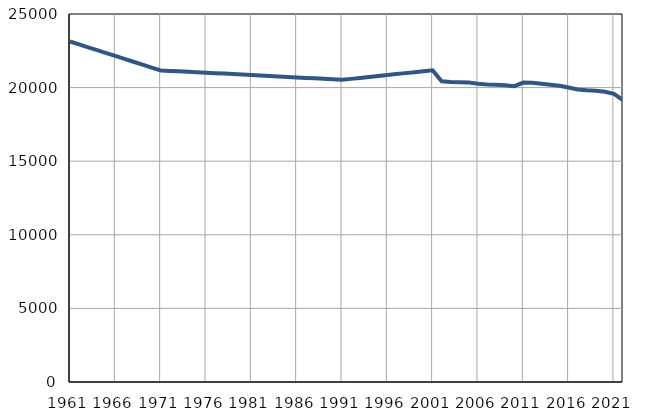
| Category | Број
становника |
|---|---|
| 1961.0 | 23131 |
| 1962.0 | 22934 |
| 1963.0 | 22738 |
| 1964.0 | 22542 |
| 1965.0 | 22345 |
| 1966.0 | 22149 |
| 1967.0 | 21952 |
| 1968.0 | 21756 |
| 1969.0 | 21559 |
| 1970.0 | 21363 |
| 1971.0 | 21166 |
| 1972.0 | 21135 |
| 1973.0 | 21105 |
| 1974.0 | 21074 |
| 1975.0 | 21044 |
| 1976.0 | 21013 |
| 1977.0 | 20982 |
| 1978.0 | 20952 |
| 1979.0 | 20921 |
| 1980.0 | 20891 |
| 1981.0 | 20860 |
| 1982.0 | 20827 |
| 1983.0 | 20793 |
| 1984.0 | 20760 |
| 1985.0 | 20727 |
| 1986.0 | 20694 |
| 1987.0 | 20660 |
| 1988.0 | 20627 |
| 1989.0 | 20594 |
| 1990.0 | 20560 |
| 1991.0 | 20527 |
| 1992.0 | 20592 |
| 1993.0 | 20658 |
| 1994.0 | 20723 |
| 1995.0 | 20788 |
| 1996.0 | 20853 |
| 1997.0 | 20919 |
| 1998.0 | 20984 |
| 1999.0 | 21049 |
| 2000.0 | 21114 |
| 2001.0 | 21180 |
| 2002.0 | 20430 |
| 2003.0 | 20385 |
| 2004.0 | 20361 |
| 2005.0 | 20339 |
| 2006.0 | 20258 |
| 2007.0 | 20207 |
| 2008.0 | 20190 |
| 2009.0 | 20157 |
| 2010.0 | 20099 |
| 2011.0 | 20338 |
| 2012.0 | 20331 |
| 2013.0 | 20257 |
| 2014.0 | 20192 |
| 2015.0 | 20126 |
| 2016.0 | 20002 |
| 2017.0 | 19870 |
| 2018.0 | 19819 |
| 2019.0 | 19788 |
| 2020.0 | 19714 |
| 2021.0 | 19572 |
| 2022.0 | 19153 |